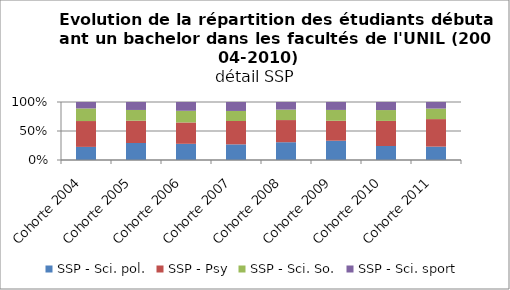
| Category | SSP - Sci. pol. | SSP - Psy | SSP - Sci. So. | SSP - Sci. sport |
|---|---|---|---|---|
| Cohorte 2004 | 104 | 205 | 100 | 51 |
| Cohorte 2005 | 141 | 185 | 89 | 66 |
| Cohorte 2006 | 129 | 170 | 93 | 70 |
| Cohorte 2007 | 103 | 154 | 66 | 59 |
| Cohorte 2008 | 126 | 157 | 74 | 54 |
| Cohorte 2009 | 146 | 151 | 82 | 60 |
| Cohorte 2010 | 120 | 215 | 93 | 69 |
| Cohorte 2011 | 118 | 243 | 93 | 58 |